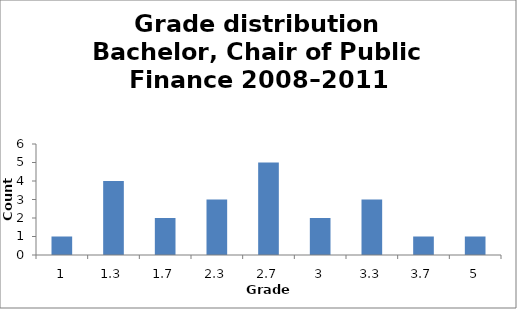
| Category | Series 0 |
|---|---|
| 1.0 | 1 |
| 1.3 | 4 |
| 1.7 | 2 |
| 2.3 | 3 |
| 2.7 | 5 |
| 3.0 | 2 |
| 3.3 | 3 |
| 3.7 | 1 |
| 5.0 | 1 |